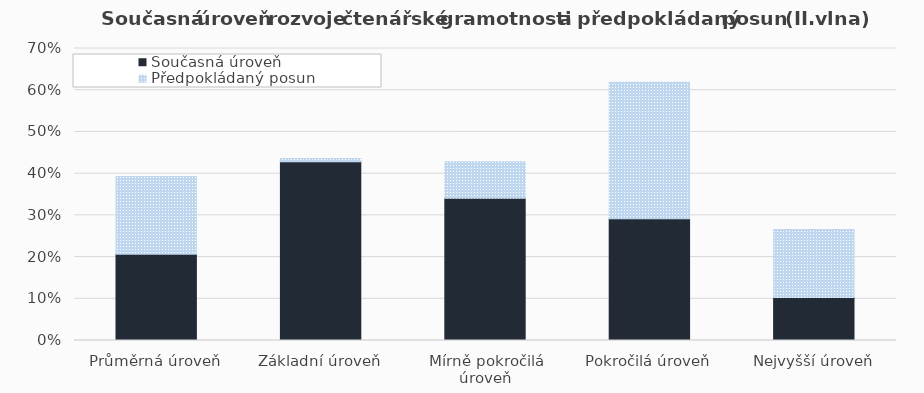
| Category | Současná úroveň | Předpokládaný posun |
|---|---|---|
| Průměrná úroveň | 0.207 | 0.186 |
| Základní úroveň | 0.429 | 0.008 |
| Mírně pokročilá úroveň | 0.341 | 0.087 |
| Pokročilá úroveň | 0.292 | 0.327 |
| Nejvyšší úroveň | 0.103 | 0.163 |